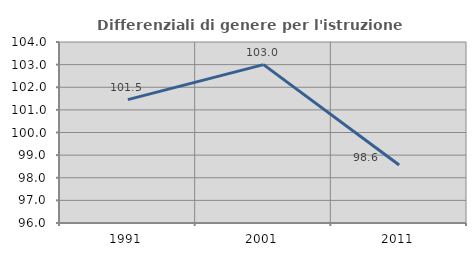
| Category | Differenziali di genere per l'istruzione superiore |
|---|---|
| 1991.0 | 101.452 |
| 2001.0 | 103.001 |
| 2011.0 | 98.566 |